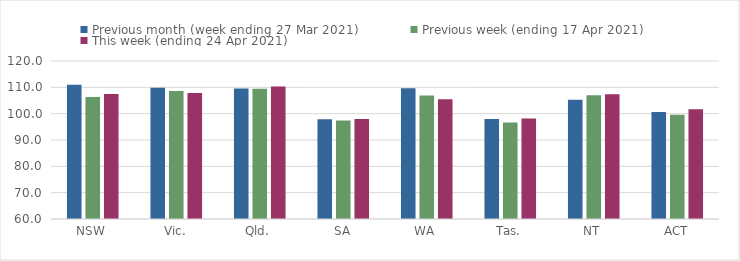
| Category | Previous month (week ending 27 Mar 2021) | Previous week (ending 17 Apr 2021) | This week (ending 24 Apr 2021) |
|---|---|---|---|
| NSW | 110.99 | 106.3 | 107.45 |
| Vic. | 109.85 | 108.65 | 107.89 |
| Qld. | 109.56 | 109.43 | 110.34 |
| SA | 97.84 | 97.44 | 98.01 |
| WA | 109.67 | 106.9 | 105.52 |
| Tas. | 98.02 | 96.62 | 98.14 |
| NT | 105.25 | 106.95 | 107.42 |
| ACT | 100.63 | 99.63 | 101.68 |